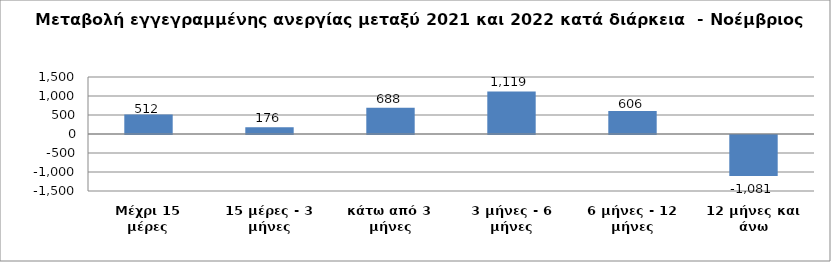
| Category | Series 0 |
|---|---|
| Μέχρι 15 μέρες | 512 |
| 15 μέρες - 3 μήνες | 176 |
| κάτω από 3 μήνες | 688 |
| 3 μήνες - 6 μήνες | 1119 |
| 6 μήνες - 12 μήνες | 606 |
| 12 μήνες και άνω | -1081 |